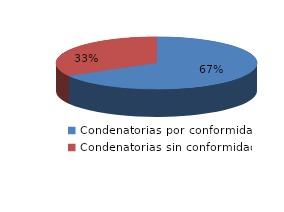
| Category | Series 0 |
|---|---|
| 0 | 705 |
| 1 | 350 |